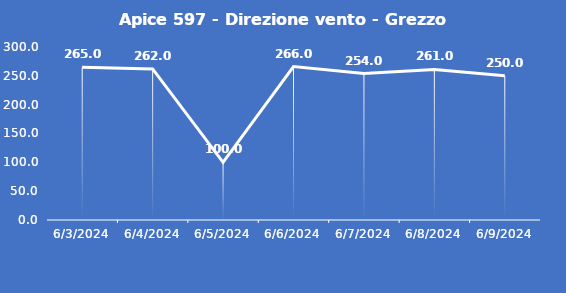
| Category | Apice 597 - Direzione vento - Grezzo (°N) |
|---|---|
| 6/3/24 | 265 |
| 6/4/24 | 262 |
| 6/5/24 | 100 |
| 6/6/24 | 266 |
| 6/7/24 | 254 |
| 6/8/24 | 261 |
| 6/9/24 | 250 |